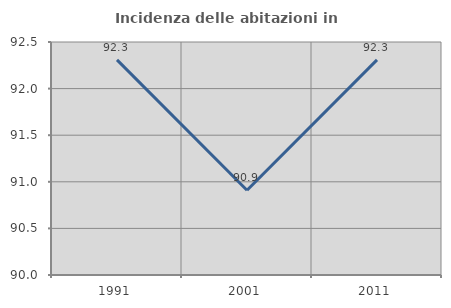
| Category | Incidenza delle abitazioni in proprietà  |
|---|---|
| 1991.0 | 92.308 |
| 2001.0 | 90.909 |
| 2011.0 | 92.308 |